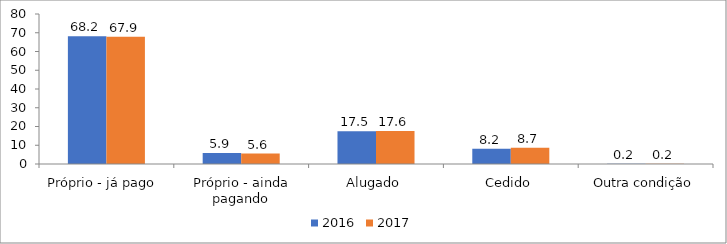
| Category | 2016 | 2017 |
|---|---|---|
| Próprio - já pago  | 68.2 | 67.9 |
| Próprio - ainda pagando | 5.9 | 5.6 |
| Alugado | 17.5 | 17.6 |
| Cedido | 8.2 | 8.7 |
| Outra condição | 0.2 | 0.2 |